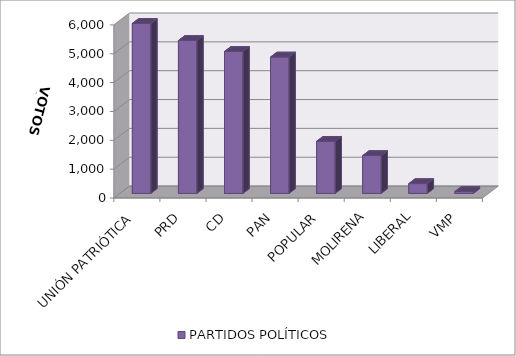
| Category | PARTIDOS POLÍTICOS |
|---|---|
| UNIÓN PATRIÓTICA | 5893 |
| PRD | 5300 |
| CD | 4921 |
| PAN | 4728 |
| POPULAR | 1807 |
| MOLIRENA | 1312 |
| LIBERAL | 339 |
| VMP | 64 |